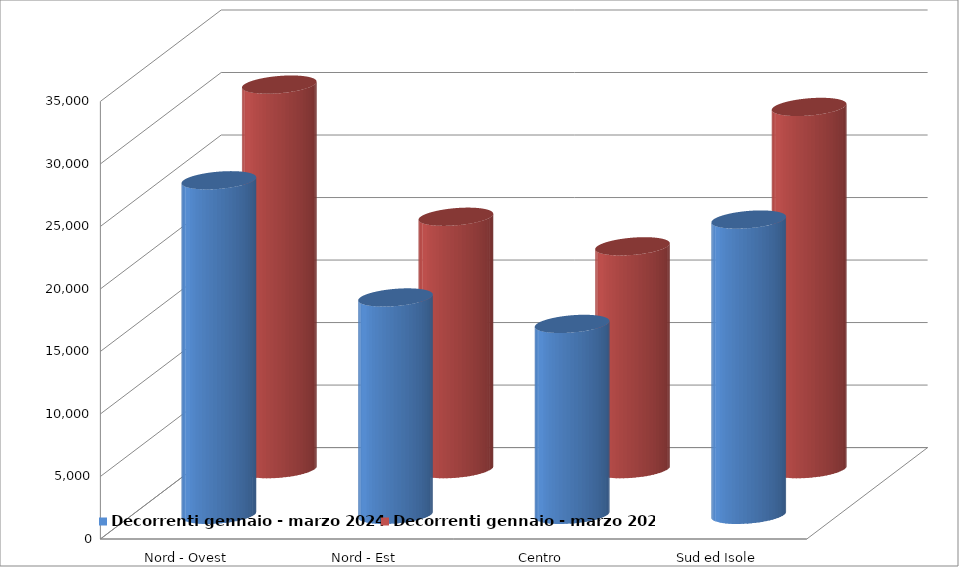
| Category | Decorrenti gennaio - marzo 2024 | Decorrenti gennaio - marzo 2023 |
|---|---|---|
| Nord - Ovest | 26762 | 30758 |
| Nord - Est | 17388 | 20188 |
| Centro | 15274 | 17824 |
| Sud ed Isole | 23620 | 28973 |